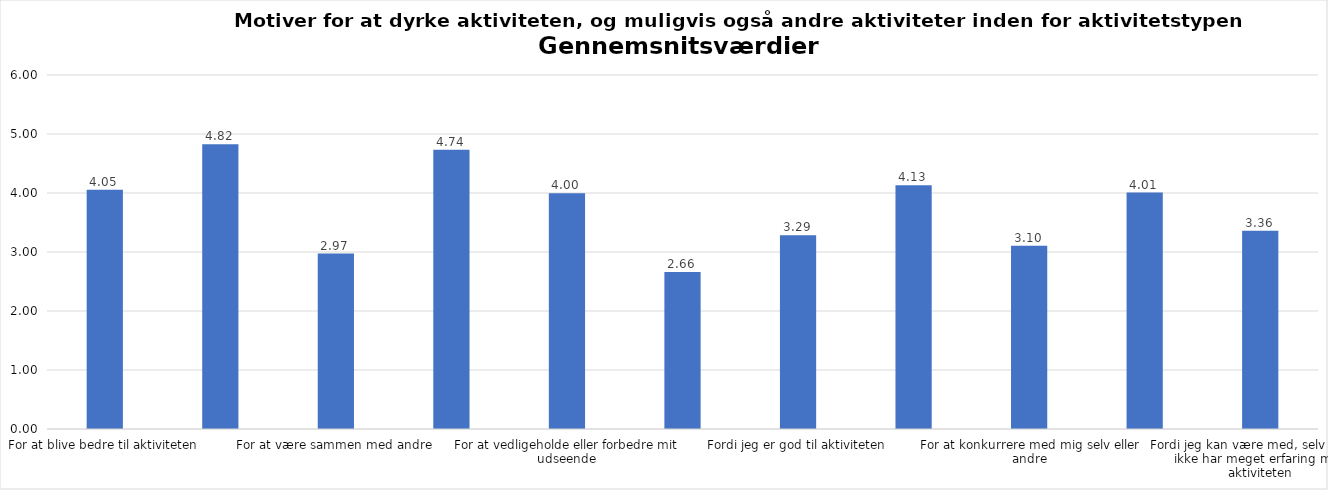
| Category | Gennemsnit |
|---|---|
| For at blive bedre til aktiviteten | 4.054 |
| For at vedligeholde eller forbedre min sundhed (fx helbred, fysisk form) | 4.825 |
| For at være sammen med andre | 2.973 |
| For at gøre noget godt for mig selv | 4.735 |
| For at vedligeholde eller forbedre mit udseende | 3.996 |
| Fordi andre i min omgangskreds opmuntrer mig til det | 2.663 |
| Fordi jeg er god til aktiviteten | 3.286 |
| Fordi jeg godt kan lide aktiviteten | 4.131 |
| For at konkurrere med mig selv eller andre | 3.105 |
| Fordi aktiviteten passer godt ind i min hverdag | 4.006 |
| Fordi jeg kan være med, selv om jeg ikke har meget erfaring med aktiviteten | 3.36 |